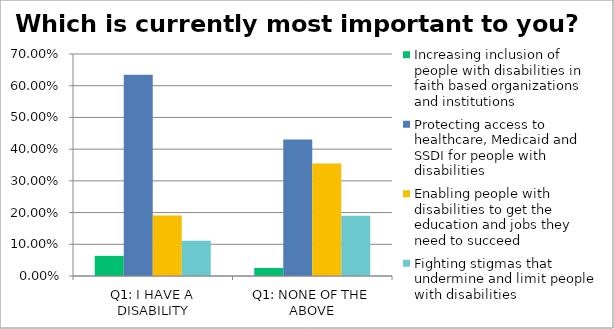
| Category | Increasing inclusion of people with disabilities in faith based organizations and institutions | Protecting access to healthcare, Medicaid and SSDI for people with disabilities | Enabling people with disabilities to get the education and jobs they need to succeed | Fighting stigmas that undermine and limit people with disabilities |
|---|---|---|---|---|
| Q1: I HAVE A DISABILITY | 0.064 | 0.635 | 0.19 | 0.111 |
| Q1: NONE OF THE ABOVE | 0.025 | 0.43 | 0.354 | 0.19 |